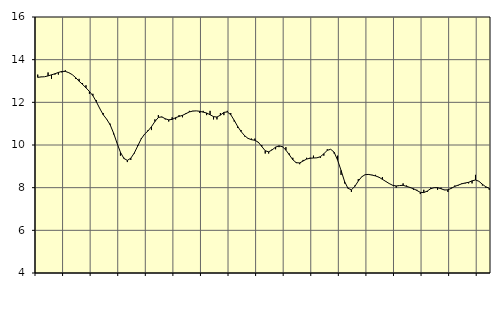
| Category | Piggar | Tillverkning av verkstadsvaror, SNI 25-30, 33 |
|---|---|---|
| nan | 13.3 | 13.17 |
| 87.0 | 13.2 | 13.19 |
| 87.0 | 13.2 | 13.2 |
| 87.0 | 13.4 | 13.24 |
| nan | 13.1 | 13.29 |
| 88.0 | 13.3 | 13.34 |
| 88.0 | 13.3 | 13.4 |
| 88.0 | 13.4 | 13.45 |
| nan | 13.5 | 13.45 |
| 89.0 | 13.4 | 13.39 |
| 89.0 | 13.3 | 13.3 |
| 89.0 | 13.1 | 13.16 |
| nan | 13.1 | 12.99 |
| 90.0 | 12.9 | 12.84 |
| 90.0 | 12.8 | 12.68 |
| 90.0 | 12.4 | 12.51 |
| nan | 12.4 | 12.31 |
| 91.0 | 12.1 | 12.03 |
| 91.0 | 11.7 | 11.71 |
| 91.0 | 11.5 | 11.42 |
| nan | 11.2 | 11.21 |
| 92.0 | 11 | 10.95 |
| 92.0 | 10.5 | 10.56 |
| 92.0 | 10.1 | 10.09 |
| nan | 9.5 | 9.66 |
| 93.0 | 9.4 | 9.37 |
| 93.0 | 9.2 | 9.28 |
| 93.0 | 9.3 | 9.38 |
| nan | 9.6 | 9.62 |
| 94.0 | 10 | 9.95 |
| 94.0 | 10.3 | 10.28 |
| 94.0 | 10.5 | 10.51 |
| nan | 10.7 | 10.66 |
| 95.0 | 10.7 | 10.86 |
| 95.0 | 11.2 | 11.1 |
| 95.0 | 11.4 | 11.29 |
| nan | 11.3 | 11.32 |
| 96.0 | 11.2 | 11.23 |
| 96.0 | 11.1 | 11.18 |
| 96.0 | 11.3 | 11.2 |
| nan | 11.2 | 11.28 |
| 97.0 | 11.4 | 11.34 |
| 97.0 | 11.3 | 11.39 |
| 97.0 | 11.5 | 11.47 |
| nan | 11.6 | 11.55 |
| 98.0 | 11.6 | 11.59 |
| 98.0 | 11.6 | 11.6 |
| 98.0 | 11.5 | 11.58 |
| nan | 11.6 | 11.54 |
| 99.0 | 11.4 | 11.5 |
| 99.0 | 11.6 | 11.42 |
| 99.0 | 11.2 | 11.33 |
| nan | 11.2 | 11.31 |
| 0.0 | 11.5 | 11.4 |
| 0.0 | 11.4 | 11.53 |
| 0.0 | 11.6 | 11.55 |
| nan | 11.5 | 11.42 |
| 1.0 | 11.1 | 11.16 |
| 1.0 | 10.8 | 10.87 |
| 1.0 | 10.7 | 10.63 |
| nan | 10.4 | 10.44 |
| 2.0 | 10.3 | 10.31 |
| 2.0 | 10.3 | 10.25 |
| 2.0 | 10.3 | 10.22 |
| nan | 10.1 | 10.13 |
| 3.0 | 10 | 9.93 |
| 3.0 | 9.6 | 9.73 |
| 3.0 | 9.6 | 9.68 |
| nan | 9.8 | 9.77 |
| 4.0 | 9.8 | 9.9 |
| 4.0 | 9.9 | 9.96 |
| 4.0 | 9.9 | 9.92 |
| nan | 9.9 | 9.76 |
| 5.0 | 9.6 | 9.54 |
| 5.0 | 9.4 | 9.31 |
| 5.0 | 9.2 | 9.17 |
| nan | 9.1 | 9.16 |
| 6.0 | 9.3 | 9.25 |
| 6.0 | 9.4 | 9.34 |
| 6.0 | 9.4 | 9.38 |
| nan | 9.5 | 9.39 |
| 7.0 | 9.4 | 9.4 |
| 7.0 | 9.4 | 9.45 |
| 7.0 | 9.5 | 9.59 |
| nan | 9.8 | 9.75 |
| 8.0 | 9.8 | 9.8 |
| 8.0 | 9.6 | 9.66 |
| 8.0 | 9.5 | 9.29 |
| nan | 8.6 | 8.81 |
| 9.0 | 8.2 | 8.3 |
| 9.0 | 8 | 7.97 |
| 9.0 | 7.8 | 7.9 |
| nan | 8.1 | 8.06 |
| 10.0 | 8.4 | 8.31 |
| 10.0 | 8.5 | 8.51 |
| 10.0 | 8.6 | 8.61 |
| nan | 8.6 | 8.62 |
| 11.0 | 8.6 | 8.59 |
| 11.0 | 8.6 | 8.55 |
| 11.0 | 8.5 | 8.49 |
| nan | 8.5 | 8.39 |
| 12.0 | 8.3 | 8.29 |
| 12.0 | 8.2 | 8.19 |
| 12.0 | 8.1 | 8.11 |
| nan | 8 | 8.08 |
| 13.0 | 8.1 | 8.1 |
| 13.0 | 8.2 | 8.11 |
| 13.0 | 8.1 | 8.06 |
| nan | 8 | 8.01 |
| 14.0 | 7.9 | 7.95 |
| 14.0 | 7.9 | 7.87 |
| 14.0 | 7.7 | 7.78 |
| nan | 7.9 | 7.77 |
| 15.0 | 7.8 | 7.84 |
| 15.0 | 8 | 7.95 |
| 15.0 | 8 | 8 |
| nan | 7.9 | 8 |
| 16.0 | 8 | 7.95 |
| 16.0 | 7.9 | 7.89 |
| 16.0 | 7.8 | 7.9 |
| nan | 8 | 7.97 |
| 17.0 | 8.1 | 8.06 |
| 17.0 | 8.1 | 8.12 |
| 17.0 | 8.2 | 8.18 |
| nan | 8.2 | 8.22 |
| 18.0 | 8.2 | 8.25 |
| 18.0 | 8.2 | 8.32 |
| 18.0 | 8.6 | 8.36 |
| nan | 8.3 | 8.3 |
| 19.0 | 8.1 | 8.16 |
| 19.0 | 8 | 8.04 |
| 19.0 | 7.9 | 7.97 |